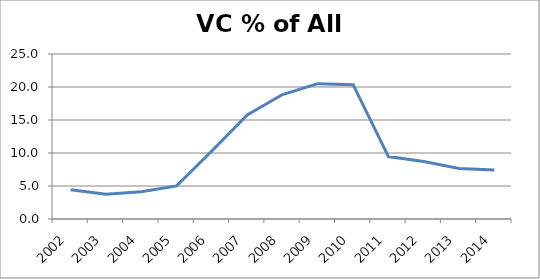
| Category | VC as % of All Seed |
|---|---|
| 2002.0 | 4.424 |
| 2003.0 | 3.748 |
| 2004.0 | 4.137 |
| 2005.0 | 5.02 |
| 2006.0 | 10.304 |
| 2007.0 | 15.75 |
| 2008.0 | 18.859 |
| 2009.0 | 20.509 |
| 2010.0 | 20.347 |
| 2011.0 | 9.455 |
| 2012.0 | 8.717 |
| 2013.0 | 7.662 |
| 2014.0 | 7.44 |